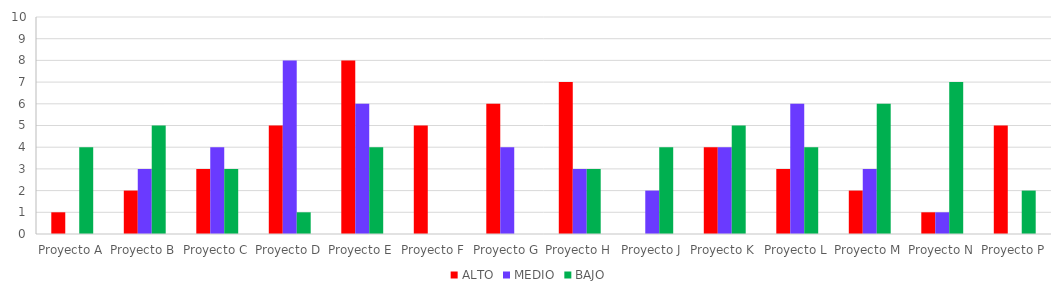
| Category | ALTO | MEDIO | BAJO |
|---|---|---|---|
| Proyecto A | 1 | 0 | 4 |
| Proyecto B | 2 | 3 | 5 |
| Proyecto C | 3 | 4 | 3 |
| Proyecto D | 5 | 8 | 1 |
| Proyecto E | 8 | 6 | 4 |
| Proyecto F | 5 | 0 | 0 |
| Proyecto G | 6 | 4 | 0 |
| Proyecto H | 7 | 3 | 3 |
| Proyecto J | 0 | 2 | 4 |
| Proyecto K | 4 | 4 | 5 |
| Proyecto L | 3 | 6 | 4 |
| Proyecto M | 2 | 3 | 6 |
| Proyecto N | 1 | 1 | 7 |
| Proyecto P | 5 | 0 | 2 |